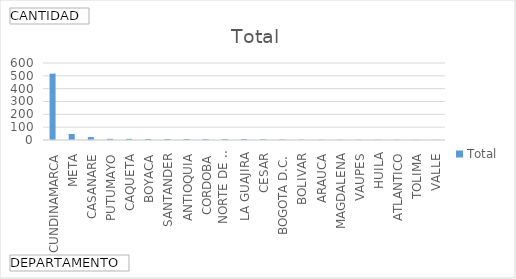
| Category | Total |
|---|---|
| CUNDINAMARCA | 517 |
| META | 47 |
| CASANARE | 23 |
| PUTUMAYO | 9 |
| CAQUETA | 9 |
| BOYACA | 8 |
| SANTANDER | 8 |
| ANTIOQUIA | 8 |
| CORDOBA | 7 |
| NORTE DE SANTANDER | 7 |
| LA GUAJIRA | 7 |
| CESAR | 5 |
| BOGOTA D.C. | 4 |
| BOLIVAR | 3 |
| ARAUCA | 2 |
| MAGDALENA | 2 |
| VAUPES | 2 |
| HUILA | 2 |
| ATLANTICO | 2 |
| TOLIMA | 1 |
| VALLE | 1 |